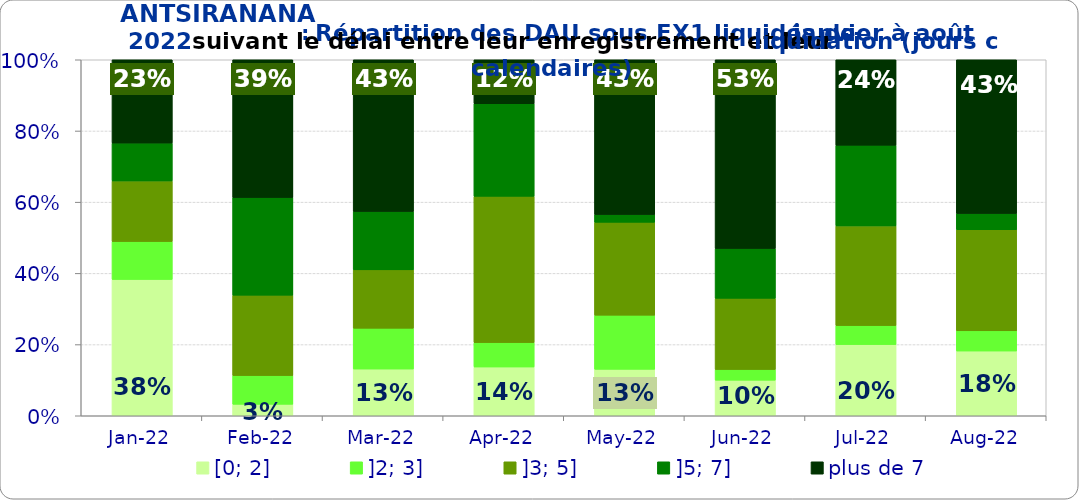
| Category | [0; 2] | ]2; 3] | ]3; 5] | ]5; 7] | plus de 7 |
|---|---|---|---|---|---|
| 2022-01-01 | 0.383 | 0.106 | 0.17 | 0.106 | 0.234 |
| 2022-02-01 | 0.032 | 0.081 | 0.226 | 0.274 | 0.387 |
| 2022-03-01 | 0.131 | 0.115 | 0.164 | 0.164 | 0.426 |
| 2022-04-01 | 0.137 | 0.068 | 0.411 | 0.26 | 0.123 |
| 2022-05-01 | 0.13 | 0.152 | 0.261 | 0.022 | 0.435 |
| 2022-06-01 | 0.1 | 0.03 | 0.2 | 0.14 | 0.53 |
| 2022-07-01 | 0.2 | 0.053 | 0.28 | 0.227 | 0.24 |
| 2022-08-01 | 0.182 | 0.057 | 0.284 | 0.045 | 0.432 |